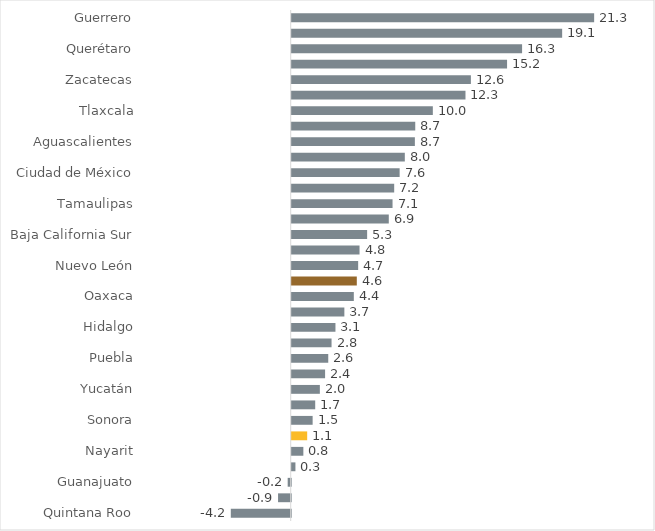
| Category | Series 0 |
|---|---|
| Quintana Roo | -4.228 |
| San Luis Potosí | -0.894 |
| Guanajuato | -0.214 |
| Coahuila | 0.262 |
| Nayarit | 0.821 |
| Jalisco | 1.092 |
| Sonora | 1.476 |
| Chihuahua | 1.658 |
| Yucatán | 1.986 |
| Estado de México | 2.355 |
| Puebla | 2.578 |
| Campeche | 2.811 |
| Hidalgo | 3.087 |
| Tabasco | 3.715 |
| Oaxaca | 4.383 |
| Nacional | 4.593 |
| Nuevo León | 4.689 |
| Baja California | 4.786 |
| Baja California Sur | 5.322 |
| Sinaloa | 6.85 |
| Tamaulipas | 7.115 |
| Michoacán | 7.231 |
| Ciudad de México | 7.616 |
| Morelos | 7.981 |
| Aguascalientes | 8.691 |
| Durango | 8.717 |
| Tlaxcala | 9.958 |
| Veracruz | 12.262 |
| Zacatecas | 12.644 |
| Colima | 15.196 |
| Querétaro | 16.256 |
| Chiapas | 19.084 |
| Guerrero | 21.341 |